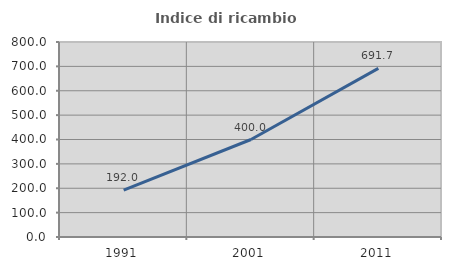
| Category | Indice di ricambio occupazionale  |
|---|---|
| 1991.0 | 192 |
| 2001.0 | 400 |
| 2011.0 | 691.667 |